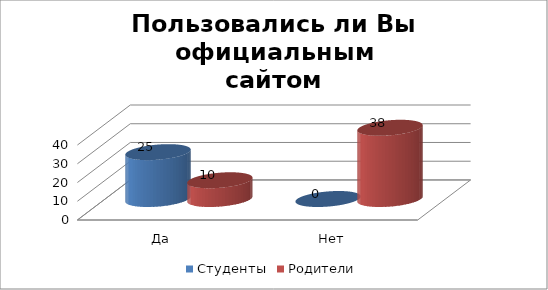
| Category | Студенты | Родители |
|---|---|---|
| Да | 25 | 10 |
| Нет | 0 | 38 |